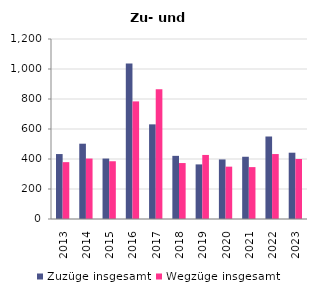
| Category | Zuzüge insgesamt | Wegzüge insgesamt |
|---|---|---|
| 2013.0 | 433 | 379 |
| 2014.0 | 502 | 403 |
| 2015.0 | 403 | 385 |
| 2016.0 | 1036 | 784 |
| 2017.0 | 631 | 865 |
| 2018.0 | 421 | 373 |
| 2019.0 | 364 | 427 |
| 2020.0 | 397 | 349 |
| 2021.0 | 415 | 346 |
| 2022.0 | 550 | 433 |
| 2023.0 | 442 | 400 |